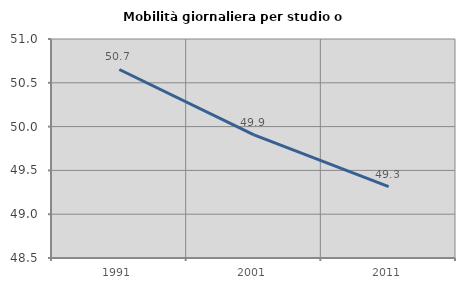
| Category | Mobilità giornaliera per studio o lavoro |
|---|---|
| 1991.0 | 50.652 |
| 2001.0 | 49.906 |
| 2011.0 | 49.314 |